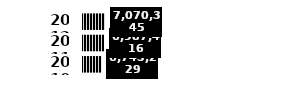
| Category | Series 0 |
|---|---|
| 2010.0 | 6743229 |
| 2011.0 | 6987416 |
| 2012.0 | 7070345 |